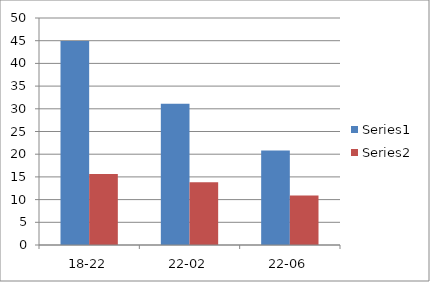
| Category | Series 0 | Series 1 |
|---|---|---|
| 18-22 | 44.929 | 15.615 |
| 22-02 | 31.118 | 13.8 |
| 22-06 | 20.833 | 10.923 |